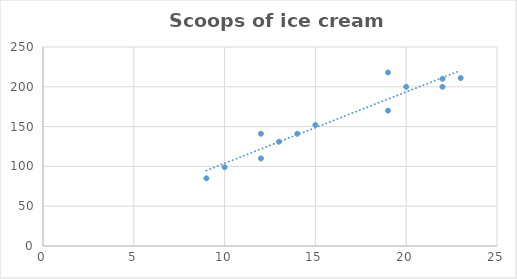
| Category | Scoops of ice cream sold |
|---|---|
| 20.0 | 200 |
| 19.0 | 218 |
| 12.0 | 141 |
| 10.0 | 99 |
| 9.0 | 85 |
| 22.0 | 210 |
| 23.0 | 211 |
| 19.0 | 170 |
| 22.0 | 200 |
| 12.0 | 110 |
| 13.0 | 131 |
| 14.0 | 141 |
| 15.0 | 152 |